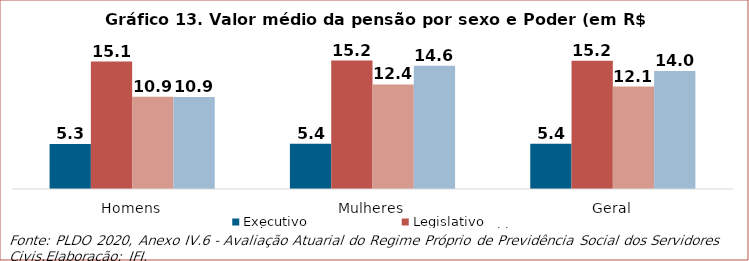
| Category | Executivo | Legislativo | Judiciário | Ministério Público |
|---|---|---|---|---|
| Homens | 5345.6 | 15101.82 | 10935.49 | 10912.58 |
| Mulheres | 5366.85 | 15219.99 | 12391.67 | 14600.75 |
| Geral | 5364.84 | 15204.87 | 12139.6 | 13983.37 |